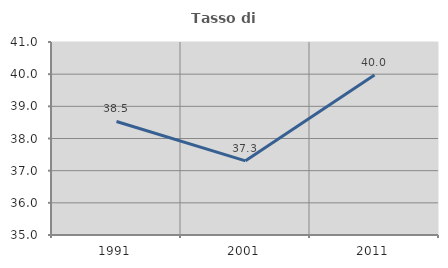
| Category | Tasso di occupazione   |
|---|---|
| 1991.0 | 38.53 |
| 2001.0 | 37.306 |
| 2011.0 | 39.976 |